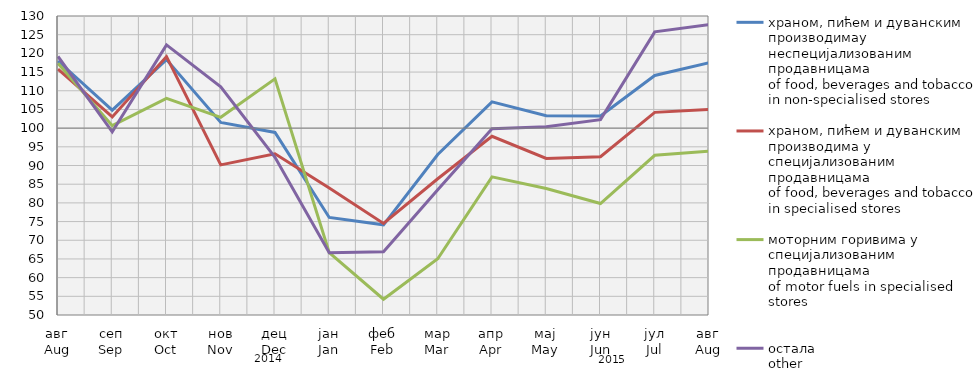
| Category | храном, пићем и дуванским производимау неспецијализованим продавницама
of food, beverages and tobacco in non-specialised stores | храном, пићем и дуванским производима у специјализовaним продавницама
of food, beverages and tobacco in specialised stores | моторним горивима у специјализованим продавницама
of motor fuels in specialised stores | остала
other |
|---|---|---|---|---|
| авг
Aug | 117.962 | 115.777 | 117.35 | 119.168 |
| сеп
Sep | 104.816 | 102.987 | 100.667 | 98.985 |
| окт
Oct | 118.329 | 119.147 | 107.958 | 122.269 |
| нов
Nov | 101.543 | 90.168 | 102.886 | 111.05 |
| дец
Dec | 98.841 | 93.152 | 113.178 | 92.21 |
| јан
Jan | 76.105 | 83.983 | 66.659 | 66.673 |
| феб
Feb | 74.124 | 74.495 | 54.212 | 66.916 |
| мар
Mar | 92.948 | 86.45 | 65.042 | 83.485 |
| апр
Apr | 107.029 | 97.818 | 86.958 | 99.837 |
| мај
May | 103.34 | 91.883 | 83.858 | 100.375 |
| јун
Jun | 103.24 | 92.338 | 79.832 | 102.276 |
| јул
Jul | 114.087 | 104.214 | 92.74 | 125.76 |
| авг
Aug | 117.466 | 104.989 | 93.864 | 127.707 |